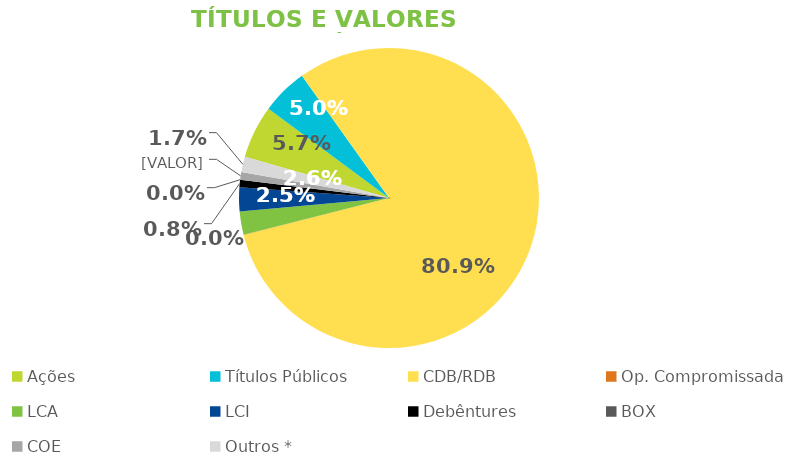
| Category | TVM |
|---|---|
| Ações | 0.057 |
| Títulos Públicos | 0.05 |
| CDB/RDB | 0.809 |
| Op. Compromissada | 0 |
| LCA | 0.025 |
| LCI | 0.026 |
| Debêntures | 0.008 |
| BOX | 0 |
| COE | 0.008 |
| Outros * | 0.017 |